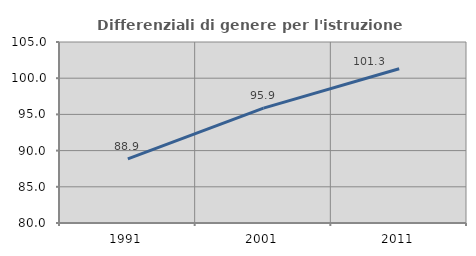
| Category | Differenziali di genere per l'istruzione superiore |
|---|---|
| 1991.0 | 88.869 |
| 2001.0 | 95.871 |
| 2011.0 | 101.312 |